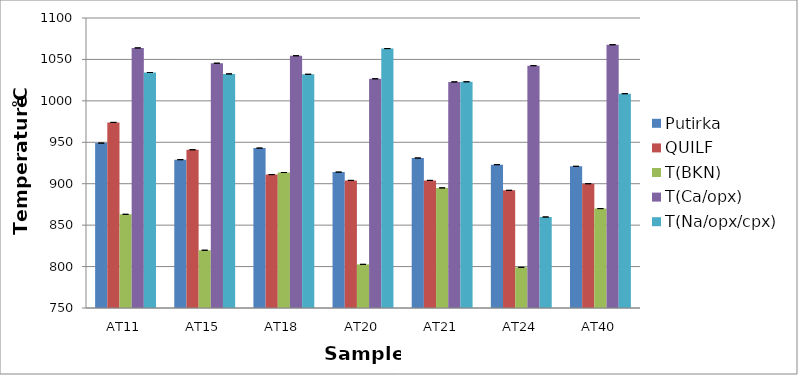
| Category | Putirka | QUILF | T(BKN) | T(Ca/opx) | T(Na/opx/cpx) |
|---|---|---|---|---|---|
| AT11 | 949 | 974 | 863.077 | 1063.893 | 1034.21 |
| AT15 | 929 | 941 | 819.73 | 1045.444 | 1032.538 |
| AT18 | 943 | 911 | 913.5 | 1054.441 | 1032.086 |
| AT20 | 914 | 904 | 802.682 | 1026.637 | 1063.082 |
| AT21 | 931 | 904 | 894.964 | 1022.867 | 1023.006 |
| AT24 | 923 | 892 | 799.042 | 1042.48 | 859.865 |
| AT40 | 921 | 900 | 869.977 | 1067.745 | 1008.67 |